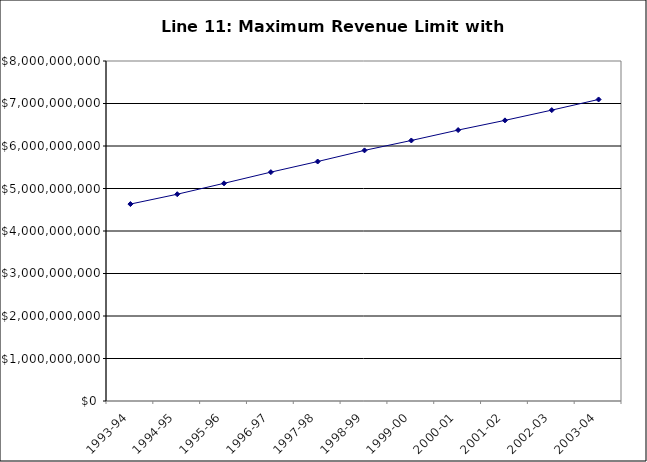
| Category | DISTRICT |
|---|---|
| 1993-94 | 4633691830.947 |
| 1994-95 | 4865181127.288 |
| 1995-96 | 5121722718.4 |
| 1996-97 | 5385146458 |
| 1997-98 | 5634662886 |
| 1998-99 | 5896746496 |
| 1999-00 | 6129823299 |
| 2000-01 | 6374902403 |
| 2001-02 | 6603017668 |
| 2002-03 | 6844182583 |
| 2003-04 | 7095077651.456 |